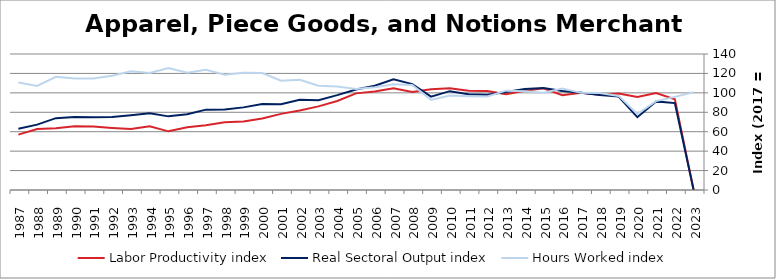
| Category | Labor Productivity index | Real Sectoral Output index | Hours Worked index |
|---|---|---|---|
| 2023.0 | 0 | 0 | 100.61 |
| 2022.0 | 93.335 | 89.466 | 95.855 |
| 2021.0 | 99.718 | 91.219 | 91.477 |
| 2020.0 | 95.84 | 74.918 | 78.17 |
| 2019.0 | 99.303 | 96.195 | 96.87 |
| 2018.0 | 97.944 | 97.831 | 99.885 |
| 2017.0 | 100 | 100 | 100 |
| 2016.0 | 97.618 | 101.909 | 104.395 |
| 2015.0 | 104.636 | 104.884 | 100.237 |
| 2014.0 | 102.182 | 103.861 | 101.642 |
| 2013.0 | 98.649 | 100.896 | 102.278 |
| 2012.0 | 101.837 | 97.947 | 96.18 |
| 2011.0 | 102.098 | 98.589 | 96.563 |
| 2010.0 | 104.695 | 101.743 | 97.18 |
| 2009.0 | 103.631 | 96.146 | 92.777 |
| 2008.0 | 100.782 | 109.007 | 108.161 |
| 2007.0 | 104.654 | 113.974 | 108.906 |
| 2006.0 | 101.493 | 107.383 | 105.803 |
| 2005.0 | 99.486 | 103.467 | 104.002 |
| 2004.0 | 91.647 | 97.681 | 106.583 |
| 2003.0 | 86.069 | 92.437 | 107.398 |
| 2002.0 | 81.853 | 92.899 | 113.496 |
| 2001.0 | 78.357 | 88.179 | 112.536 |
| 2000.0 | 73.631 | 88.602 | 120.332 |
| 1999.0 | 70.478 | 85.054 | 120.683 |
| 1998.0 | 69.847 | 82.913 | 118.707 |
| 1997.0 | 66.774 | 82.719 | 123.878 |
| 1996.0 | 64.667 | 78.035 | 120.672 |
| 1995.0 | 60.383 | 75.803 | 125.538 |
| 1994.0 | 65.59 | 78.954 | 120.374 |
| 1993.0 | 62.866 | 76.854 | 122.249 |
| 1992.0 | 63.876 | 75.127 | 117.615 |
| 1991.0 | 65.259 | 74.845 | 114.69 |
| 1990.0 | 65.504 | 75.223 | 114.837 |
| 1989.0 | 63.477 | 73.949 | 116.497 |
| 1988.0 | 62.776 | 67.271 | 107.16 |
| 1987.0 | 56.988 | 63.026 | 110.595 |